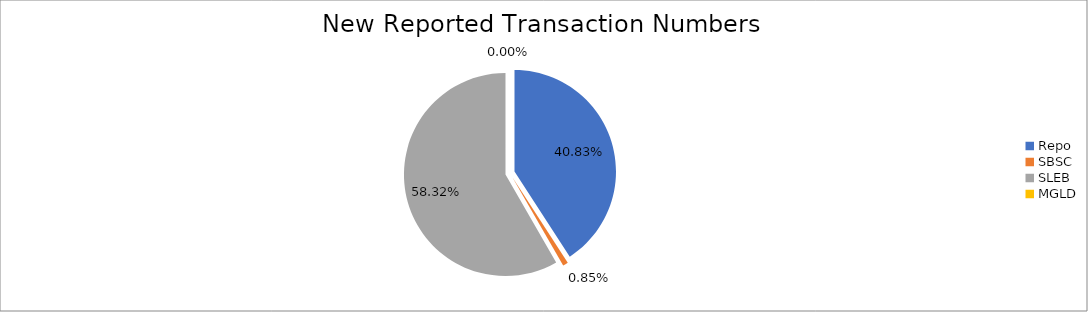
| Category | Series 0 |
|---|---|
| Repo | 469227 |
| SBSC | 9730 |
| SLEB | 670138 |
| MGLD | 22 |